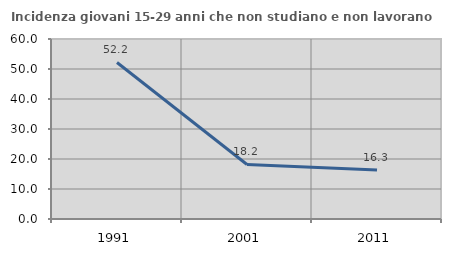
| Category | Incidenza giovani 15-29 anni che non studiano e non lavorano  |
|---|---|
| 1991.0 | 52.18 |
| 2001.0 | 18.182 |
| 2011.0 | 16.327 |